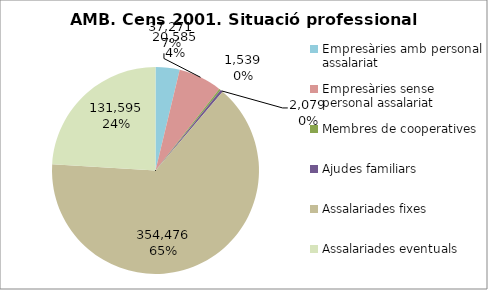
| Category | Series 0 |
|---|---|
| Empresàries amb personal assalariat | 20585 |
| Empresàries sense personal assalariat | 37271 |
| Membres de cooperatives | 1539 |
| Ajudes familiars | 2079 |
| Assalariades fixes | 354476 |
| Assalariades eventuals | 131595 |